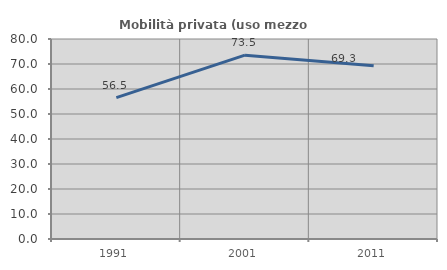
| Category | Mobilità privata (uso mezzo privato) |
|---|---|
| 1991.0 | 56.522 |
| 2001.0 | 73.545 |
| 2011.0 | 69.277 |